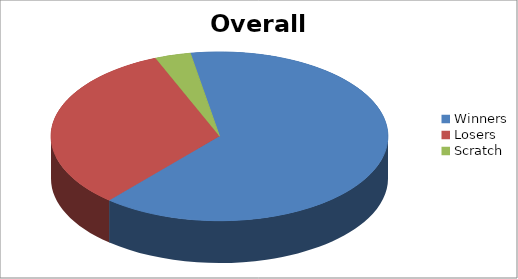
| Category | Series 1 |
|---|---|
| Winners | 75 |
| Losers | 38 |
| Scratch | 4 |